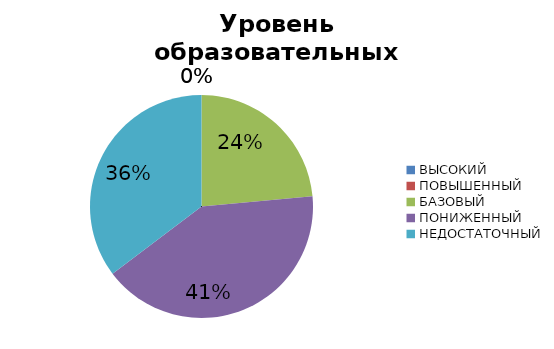
| Category | Series 0 |
|---|---|
| ВЫСОКИЙ | 0 |
| ПОВЫШЕННЫЙ | 0 |
| БАЗОВЫЙ | 23.529 |
| ПОНИЖЕННЫЙ | 41.176 |
| НЕДОСТАТОЧНЫЙ | 35.294 |